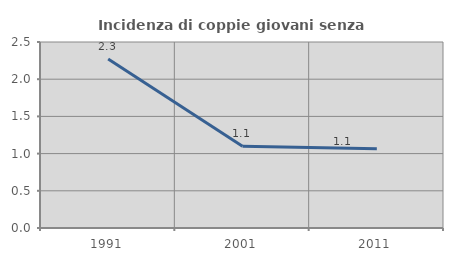
| Category | Incidenza di coppie giovani senza figli |
|---|---|
| 1991.0 | 2.273 |
| 2001.0 | 1.099 |
| 2011.0 | 1.064 |